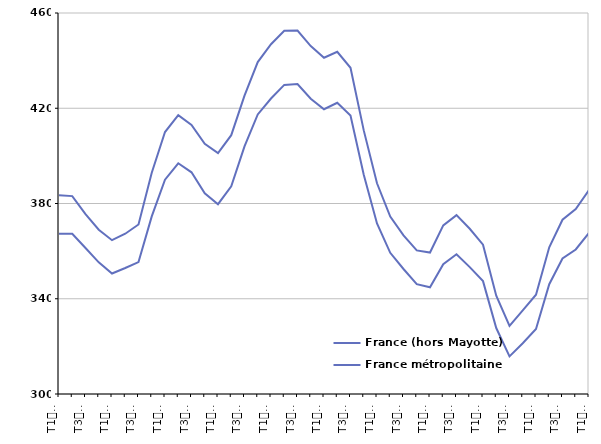
| Category | France (hors Mayotte) | France métropolitaine |
|---|---|---|
| T1
2012 | 383.5 | 367.3 |
| T2
2012 | 383.1 | 367.3 |
| T3
2012 | 375.5 | 361.3 |
| T4
2012 | 369 | 355.3 |
| T1
2013 | 364.6 | 350.6 |
| T2
2013 | 367.3 | 352.9 |
| T3
2013 | 371.2 | 355.4 |
| T4
2013 | 392.9 | 374.6 |
| T1
2014 | 410 | 390 |
| T2
2014 | 417.1 | 396.9 |
| T3
2014 | 413 | 393.1 |
| T4
2014 | 405.1 | 384.3 |
| T1
2015 | 401.2 | 379.7 |
| T2
2015 | 408.7 | 387.2 |
| T3
2015 | 425.3 | 404 |
| T4
2015 | 439.4 | 417.4 |
| T1
2016 | 446.9 | 424.1 |
| T2
2016 | 452.5 | 429.8 |
| T3
2016 | 452.6 | 430.2 |
| T4
2016 | 446.1 | 424 |
| T1
2017 | 441.2 | 419.6 |
| T2
2017 | 443.7 | 422.3 |
| T3
2017 | 437 | 416.9 |
| T4
2017 | 410.7 | 392.1 |
| T1
2018 | 388.5 | 371.6 |
| T2
2018 | 374.5 | 359.3 |
| T3
2018 | 366.6 | 352.5 |
| T4
2018 | 360.3 | 346.1 |
| T1
2019 | 359.4 | 344.8 |
| T2
2019 | 370.8 | 354.5 |
| T3
2019 | 375.1 | 358.7 |
| T4
2019 | 369.4 | 353.3 |
| T1
2020 | 362.7 | 347.4 |
| T2
2020 | 341.3 | 327.7 |
| T3
2020 | 328.6 | 315.8 |
| T4
2020 | 335.1 | 321.3 |
| T1
2021 | 341.7 | 327.3 |
| T2
2021 | 361.6 | 346.1 |
| T3
2021 | 373.2 | 356.9 |
| T4
2021 | 377.7 | 360.7 |
| T1
2022 | 385.6 | 367.7 |